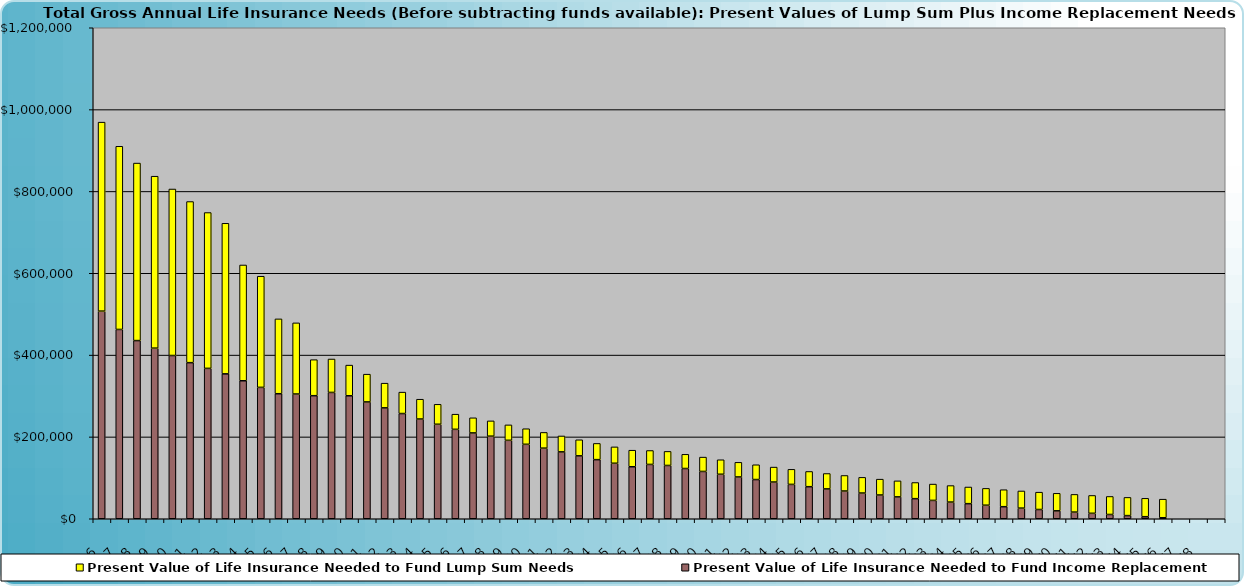
| Category | Present Value of Life Insurance Needed to Fund Income Replacement | Present Value of Life Insurance Needed to Fund Lump Sum Needs |
|---|---|---|
| 2016.0 | 507417.276 | 461905.178 |
| 2017.0 | 462653.27 | 447674.666 |
| 2018.0 | 435466.075 | 433804.824 |
| 2019.0 | 416948.169 | 420238.616 |
| 2020.0 | 398949.983 | 406923.781 |
| 2021.0 | 381462.205 | 393812.012 |
| 2022.0 | 367534.312 | 380858.252 |
| 2023.0 | 354123.369 | 368020.085 |
| 2024.0 | 337268.986 | 282942.343 |
| 2025.0 | 321090.032 | 271662.374 |
| 2026.0 | 305560.918 | 182923.136 |
| 2027.0 | 304861.137 | 173870.614 |
| 2028.0 | 300740.027 | 88058.559 |
| 2029.0 | 308721.365 | 81694.893 |
| 2030.0 | 300541.52 | 74971.676 |
| 2031.0 | 285509.934 | 67860.39 |
| 2032.0 | 271050.818 | 60331.809 |
| 2033.0 | 257145.505 | 52355.811 |
| 2034.0 | 243775.725 | 48382.363 |
| 2035.0 | 230923.61 | 48780.353 |
| 2036.0 | 218571.71 | 36993.297 |
| 2037.0 | 209753.588 | 36971.758 |
| 2038.0 | 201832.731 | 37341.476 |
| 2039.0 | 191705.544 | 37714.891 |
| 2040.0 | 181943.019 | 38092.039 |
| 2041.0 | 172532.468 | 38472.96 |
| 2042.0 | 163461.621 | 38857.689 |
| 2043.0 | 153757.902 | 39246.266 |
| 2044.0 | 144480.116 | 39638.729 |
| 2045.0 | 135604.679 | 40035.116 |
| 2046.0 | 127109.798 | 40435.467 |
| 2047.0 | 132763.275 | 34033.185 |
| 2048.0 | 130242.804 | 34373.517 |
| 2049.0 | 122774.304 | 34717.252 |
| 2050.0 | 115613.939 | 35064.425 |
| 2051.0 | 108746.633 | 35415.069 |
| 2052.0 | 102158.302 | 35769.22 |
| 2053.0 | 95835.773 | 36126.912 |
| 2054.0 | 89766.696 | 36488.181 |
| 2055.0 | 83939.484 | 36853.063 |
| 2056.0 | 78343.239 | 37221.593 |
| 2057.0 | 72967.702 | 37593.809 |
| 2058.0 | 67803.199 | 37969.747 |
| 2059.0 | 62840.597 | 38349.445 |
| 2060.0 | 58071.257 | 38732.939 |
| 2061.0 | 53487.005 | 39120.269 |
| 2062.0 | 49080.089 | 39511.471 |
| 2063.0 | 44843.156 | 39906.586 |
| 2064.0 | 40769.219 | 40305.652 |
| 2065.0 | 36851.635 | 40708.708 |
| 2066.0 | 33084.079 | 41115.796 |
| 2067.0 | 29460.528 | 41526.954 |
| 2068.0 | 25975.236 | 41942.223 |
| 2069.0 | 22622.721 | 42361.645 |
| 2070.0 | 19397.75 | 42785.262 |
| 2071.0 | 16295.317 | 43213.114 |
| 2072.0 | 13310.641 | 43645.245 |
| 2073.0 | 10439.142 | 44081.698 |
| 2074.0 | 7676.439 | 44522.515 |
| 2075.0 | 5018.335 | 44967.74 |
| 2076.0 | 2460.808 | 45417.417 |
| 2077.0 | 0 | 0 |
| 2078.0 | 0 | 0 |